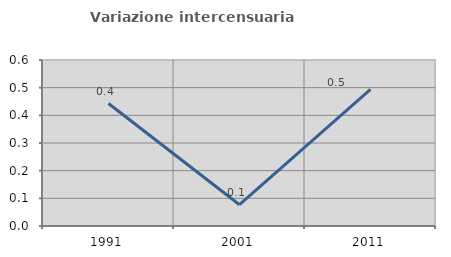
| Category | Variazione intercensuaria annua |
|---|---|
| 1991.0 | 0.443 |
| 2001.0 | 0.077 |
| 2011.0 | 0.494 |